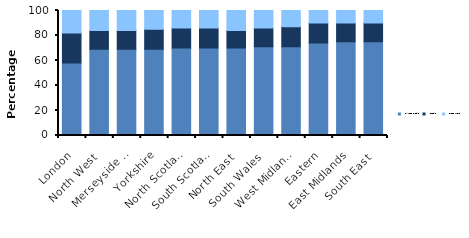
| Category | Direct Debit | Credit | Prepayment |
|---|---|---|---|
| London | 58 | 24 | 18 |
| North West | 69 | 15 | 16 |
| Merseyside & North Wales | 69 | 15 | 16 |
| Yorkshire | 69 | 16 | 15 |
| North Scotland | 70 | 16 | 14 |
| South Scotland | 70 | 16 | 14 |
| North East | 70 | 14 | 16 |
| South Wales | 71 | 15 | 15 |
| West Midlands | 71 | 16 | 13 |
| Eastern | 74 | 16 | 10 |
| East Midlands | 75 | 15 | 10 |
| South East | 75 | 15 | 10 |